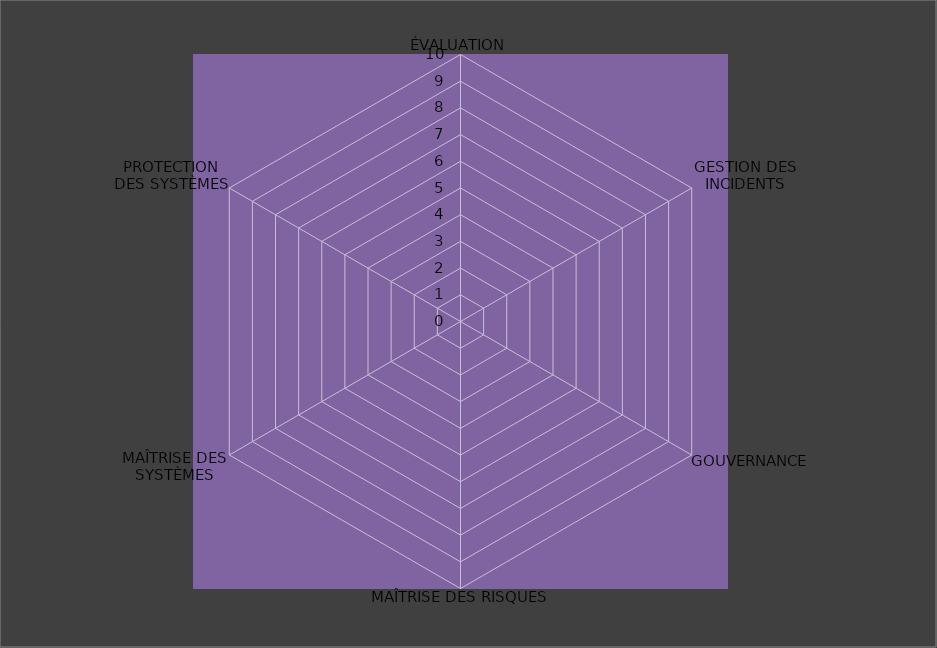
| Category | Année 2025 |
|---|---|
| ÉVALUATION | 0 |
| GESTION DES INCIDENTS | 0 |
| GOUVERNANCE | 0 |
| MAÎTRISE DES RISQUES | 0 |
| MAÎTRISE DES SYSTÈMES | 0 |
| PROTECTION
DES SYSTÈMES | 0 |